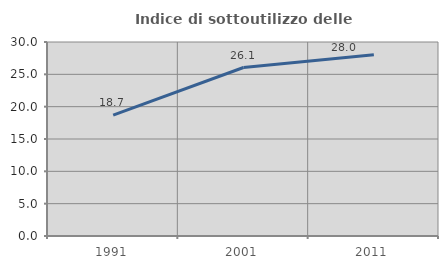
| Category | Indice di sottoutilizzo delle abitazioni  |
|---|---|
| 1991.0 | 18.699 |
| 2001.0 | 26.056 |
| 2011.0 | 28.02 |